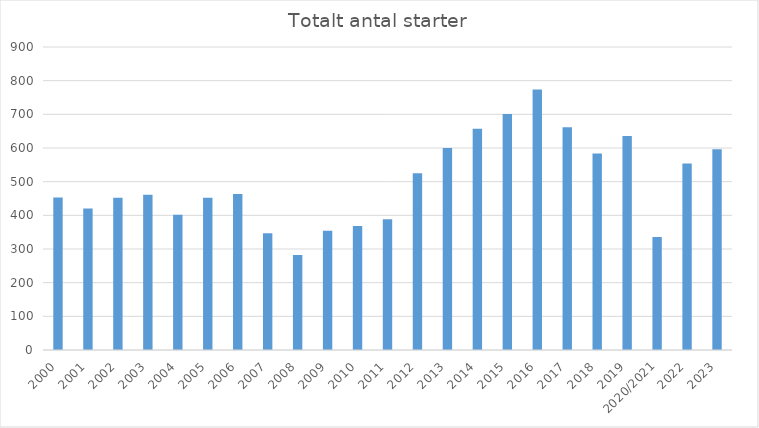
| Category | Totalt antal starter |
|---|---|
| 2000 | 453 |
| 2001 | 420 |
| 2002 | 452 |
| 2003 | 461 |
| 2004 | 402 |
| 2005 | 452 |
| 2006 | 463 |
| 2007 | 347 |
| 2008 | 282 |
| 2009 | 354 |
| 2010 | 368 |
| 2011 | 388 |
| 2012 | 525 |
| 2013 | 600 |
| 2014 | 657 |
| 2015 | 701 |
| 2016 | 774 |
| 2017 | 662 |
| 2018 | 584 |
| 2019 | 636 |
| 2020/2021 | 336 |
| 2022 | 554 |
| 2023 | 596 |